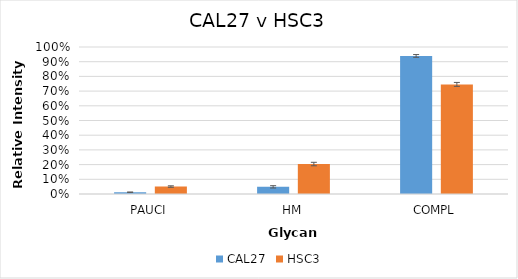
| Category | CAL27 | HSC3 |
|---|---|---|
| PAUCI | 0.012 | 0.051 |
| HM | 0.049 | 0.204 |
| COMPL | 0.939 | 0.746 |